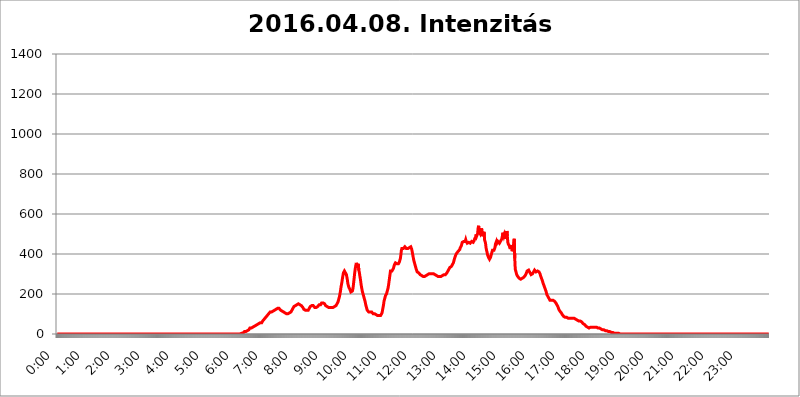
| Category | 2016.04.08. Intenzitás [W/m^2] |
|---|---|
| 0.0 | 0 |
| 0.0006944444444444445 | 0 |
| 0.001388888888888889 | 0 |
| 0.0020833333333333333 | 0 |
| 0.002777777777777778 | 0 |
| 0.003472222222222222 | 0 |
| 0.004166666666666667 | 0 |
| 0.004861111111111111 | 0 |
| 0.005555555555555556 | 0 |
| 0.0062499999999999995 | 0 |
| 0.006944444444444444 | 0 |
| 0.007638888888888889 | 0 |
| 0.008333333333333333 | 0 |
| 0.009027777777777779 | 0 |
| 0.009722222222222222 | 0 |
| 0.010416666666666666 | 0 |
| 0.011111111111111112 | 0 |
| 0.011805555555555555 | 0 |
| 0.012499999999999999 | 0 |
| 0.013194444444444444 | 0 |
| 0.013888888888888888 | 0 |
| 0.014583333333333332 | 0 |
| 0.015277777777777777 | 0 |
| 0.015972222222222224 | 0 |
| 0.016666666666666666 | 0 |
| 0.017361111111111112 | 0 |
| 0.018055555555555557 | 0 |
| 0.01875 | 0 |
| 0.019444444444444445 | 0 |
| 0.02013888888888889 | 0 |
| 0.020833333333333332 | 0 |
| 0.02152777777777778 | 0 |
| 0.022222222222222223 | 0 |
| 0.02291666666666667 | 0 |
| 0.02361111111111111 | 0 |
| 0.024305555555555556 | 0 |
| 0.024999999999999998 | 0 |
| 0.025694444444444447 | 0 |
| 0.02638888888888889 | 0 |
| 0.027083333333333334 | 0 |
| 0.027777777777777776 | 0 |
| 0.02847222222222222 | 0 |
| 0.029166666666666664 | 0 |
| 0.029861111111111113 | 0 |
| 0.030555555555555555 | 0 |
| 0.03125 | 0 |
| 0.03194444444444445 | 0 |
| 0.03263888888888889 | 0 |
| 0.03333333333333333 | 0 |
| 0.034027777777777775 | 0 |
| 0.034722222222222224 | 0 |
| 0.035416666666666666 | 0 |
| 0.036111111111111115 | 0 |
| 0.03680555555555556 | 0 |
| 0.0375 | 0 |
| 0.03819444444444444 | 0 |
| 0.03888888888888889 | 0 |
| 0.03958333333333333 | 0 |
| 0.04027777777777778 | 0 |
| 0.04097222222222222 | 0 |
| 0.041666666666666664 | 0 |
| 0.042361111111111106 | 0 |
| 0.04305555555555556 | 0 |
| 0.043750000000000004 | 0 |
| 0.044444444444444446 | 0 |
| 0.04513888888888889 | 0 |
| 0.04583333333333334 | 0 |
| 0.04652777777777778 | 0 |
| 0.04722222222222222 | 0 |
| 0.04791666666666666 | 0 |
| 0.04861111111111111 | 0 |
| 0.049305555555555554 | 0 |
| 0.049999999999999996 | 0 |
| 0.05069444444444445 | 0 |
| 0.051388888888888894 | 0 |
| 0.052083333333333336 | 0 |
| 0.05277777777777778 | 0 |
| 0.05347222222222222 | 0 |
| 0.05416666666666667 | 0 |
| 0.05486111111111111 | 0 |
| 0.05555555555555555 | 0 |
| 0.05625 | 0 |
| 0.05694444444444444 | 0 |
| 0.057638888888888885 | 0 |
| 0.05833333333333333 | 0 |
| 0.05902777777777778 | 0 |
| 0.059722222222222225 | 0 |
| 0.06041666666666667 | 0 |
| 0.061111111111111116 | 0 |
| 0.06180555555555556 | 0 |
| 0.0625 | 0 |
| 0.06319444444444444 | 0 |
| 0.06388888888888888 | 0 |
| 0.06458333333333334 | 0 |
| 0.06527777777777778 | 0 |
| 0.06597222222222222 | 0 |
| 0.06666666666666667 | 0 |
| 0.06736111111111111 | 0 |
| 0.06805555555555555 | 0 |
| 0.06874999999999999 | 0 |
| 0.06944444444444443 | 0 |
| 0.07013888888888889 | 0 |
| 0.07083333333333333 | 0 |
| 0.07152777777777779 | 0 |
| 0.07222222222222223 | 0 |
| 0.07291666666666667 | 0 |
| 0.07361111111111111 | 0 |
| 0.07430555555555556 | 0 |
| 0.075 | 0 |
| 0.07569444444444444 | 0 |
| 0.0763888888888889 | 0 |
| 0.07708333333333334 | 0 |
| 0.07777777777777778 | 0 |
| 0.07847222222222222 | 0 |
| 0.07916666666666666 | 0 |
| 0.0798611111111111 | 0 |
| 0.08055555555555556 | 0 |
| 0.08125 | 0 |
| 0.08194444444444444 | 0 |
| 0.08263888888888889 | 0 |
| 0.08333333333333333 | 0 |
| 0.08402777777777777 | 0 |
| 0.08472222222222221 | 0 |
| 0.08541666666666665 | 0 |
| 0.08611111111111112 | 0 |
| 0.08680555555555557 | 0 |
| 0.08750000000000001 | 0 |
| 0.08819444444444445 | 0 |
| 0.08888888888888889 | 0 |
| 0.08958333333333333 | 0 |
| 0.09027777777777778 | 0 |
| 0.09097222222222222 | 0 |
| 0.09166666666666667 | 0 |
| 0.09236111111111112 | 0 |
| 0.09305555555555556 | 0 |
| 0.09375 | 0 |
| 0.09444444444444444 | 0 |
| 0.09513888888888888 | 0 |
| 0.09583333333333333 | 0 |
| 0.09652777777777777 | 0 |
| 0.09722222222222222 | 0 |
| 0.09791666666666667 | 0 |
| 0.09861111111111111 | 0 |
| 0.09930555555555555 | 0 |
| 0.09999999999999999 | 0 |
| 0.10069444444444443 | 0 |
| 0.1013888888888889 | 0 |
| 0.10208333333333335 | 0 |
| 0.10277777777777779 | 0 |
| 0.10347222222222223 | 0 |
| 0.10416666666666667 | 0 |
| 0.10486111111111111 | 0 |
| 0.10555555555555556 | 0 |
| 0.10625 | 0 |
| 0.10694444444444444 | 0 |
| 0.1076388888888889 | 0 |
| 0.10833333333333334 | 0 |
| 0.10902777777777778 | 0 |
| 0.10972222222222222 | 0 |
| 0.1111111111111111 | 0 |
| 0.11180555555555556 | 0 |
| 0.11180555555555556 | 0 |
| 0.1125 | 0 |
| 0.11319444444444444 | 0 |
| 0.11388888888888889 | 0 |
| 0.11458333333333333 | 0 |
| 0.11527777777777777 | 0 |
| 0.11597222222222221 | 0 |
| 0.11666666666666665 | 0 |
| 0.1173611111111111 | 0 |
| 0.11805555555555557 | 0 |
| 0.11944444444444445 | 0 |
| 0.12013888888888889 | 0 |
| 0.12083333333333333 | 0 |
| 0.12152777777777778 | 0 |
| 0.12222222222222223 | 0 |
| 0.12291666666666667 | 0 |
| 0.12291666666666667 | 0 |
| 0.12361111111111112 | 0 |
| 0.12430555555555556 | 0 |
| 0.125 | 0 |
| 0.12569444444444444 | 0 |
| 0.12638888888888888 | 0 |
| 0.12708333333333333 | 0 |
| 0.16875 | 0 |
| 0.12847222222222224 | 0 |
| 0.12916666666666668 | 0 |
| 0.12986111111111112 | 0 |
| 0.13055555555555556 | 0 |
| 0.13125 | 0 |
| 0.13194444444444445 | 0 |
| 0.1326388888888889 | 0 |
| 0.13333333333333333 | 0 |
| 0.13402777777777777 | 0 |
| 0.13402777777777777 | 0 |
| 0.13472222222222222 | 0 |
| 0.13541666666666666 | 0 |
| 0.1361111111111111 | 0 |
| 0.13749999999999998 | 0 |
| 0.13819444444444443 | 0 |
| 0.1388888888888889 | 0 |
| 0.13958333333333334 | 0 |
| 0.14027777777777778 | 0 |
| 0.14097222222222222 | 0 |
| 0.14166666666666666 | 0 |
| 0.1423611111111111 | 0 |
| 0.14305555555555557 | 0 |
| 0.14375000000000002 | 0 |
| 0.14444444444444446 | 0 |
| 0.1451388888888889 | 0 |
| 0.1451388888888889 | 0 |
| 0.14652777777777778 | 0 |
| 0.14722222222222223 | 0 |
| 0.14791666666666667 | 0 |
| 0.1486111111111111 | 0 |
| 0.14930555555555555 | 0 |
| 0.15 | 0 |
| 0.15069444444444444 | 0 |
| 0.15138888888888888 | 0 |
| 0.15208333333333332 | 0 |
| 0.15277777777777776 | 0 |
| 0.15347222222222223 | 0 |
| 0.15416666666666667 | 0 |
| 0.15486111111111112 | 0 |
| 0.15555555555555556 | 0 |
| 0.15625 | 0 |
| 0.15694444444444444 | 0 |
| 0.15763888888888888 | 0 |
| 0.15833333333333333 | 0 |
| 0.15902777777777777 | 0 |
| 0.15972222222222224 | 0 |
| 0.16041666666666668 | 0 |
| 0.16111111111111112 | 0 |
| 0.16180555555555556 | 0 |
| 0.1625 | 0 |
| 0.16319444444444445 | 0 |
| 0.1638888888888889 | 0 |
| 0.16458333333333333 | 0 |
| 0.16527777777777777 | 0 |
| 0.16597222222222222 | 0 |
| 0.16666666666666666 | 0 |
| 0.1673611111111111 | 0 |
| 0.16805555555555554 | 0 |
| 0.16874999999999998 | 0 |
| 0.16944444444444443 | 0 |
| 0.17013888888888887 | 0 |
| 0.1708333333333333 | 0 |
| 0.17152777777777775 | 0 |
| 0.17222222222222225 | 0 |
| 0.1729166666666667 | 0 |
| 0.17361111111111113 | 0 |
| 0.17430555555555557 | 0 |
| 0.17500000000000002 | 0 |
| 0.17569444444444446 | 0 |
| 0.1763888888888889 | 0 |
| 0.17708333333333334 | 0 |
| 0.17777777777777778 | 0 |
| 0.17847222222222223 | 0 |
| 0.17916666666666667 | 0 |
| 0.1798611111111111 | 0 |
| 0.18055555555555555 | 0 |
| 0.18125 | 0 |
| 0.18194444444444444 | 0 |
| 0.1826388888888889 | 0 |
| 0.18333333333333335 | 0 |
| 0.1840277777777778 | 0 |
| 0.18472222222222223 | 0 |
| 0.18541666666666667 | 0 |
| 0.18611111111111112 | 0 |
| 0.18680555555555556 | 0 |
| 0.1875 | 0 |
| 0.18819444444444444 | 0 |
| 0.18888888888888888 | 0 |
| 0.18958333333333333 | 0 |
| 0.19027777777777777 | 0 |
| 0.1909722222222222 | 0 |
| 0.19166666666666665 | 0 |
| 0.19236111111111112 | 0 |
| 0.19305555555555554 | 0 |
| 0.19375 | 0 |
| 0.19444444444444445 | 0 |
| 0.1951388888888889 | 0 |
| 0.19583333333333333 | 0 |
| 0.19652777777777777 | 0 |
| 0.19722222222222222 | 0 |
| 0.19791666666666666 | 0 |
| 0.1986111111111111 | 0 |
| 0.19930555555555554 | 0 |
| 0.19999999999999998 | 0 |
| 0.20069444444444443 | 0 |
| 0.20138888888888887 | 0 |
| 0.2020833333333333 | 0 |
| 0.2027777777777778 | 0 |
| 0.2034722222222222 | 0 |
| 0.2041666666666667 | 0 |
| 0.20486111111111113 | 0 |
| 0.20555555555555557 | 0 |
| 0.20625000000000002 | 0 |
| 0.20694444444444446 | 0 |
| 0.2076388888888889 | 0 |
| 0.20833333333333334 | 0 |
| 0.20902777777777778 | 0 |
| 0.20972222222222223 | 0 |
| 0.21041666666666667 | 0 |
| 0.2111111111111111 | 0 |
| 0.21180555555555555 | 0 |
| 0.2125 | 0 |
| 0.21319444444444444 | 0 |
| 0.2138888888888889 | 0 |
| 0.21458333333333335 | 0 |
| 0.2152777777777778 | 0 |
| 0.21597222222222223 | 0 |
| 0.21666666666666667 | 0 |
| 0.21736111111111112 | 0 |
| 0.21805555555555556 | 0 |
| 0.21875 | 0 |
| 0.21944444444444444 | 0 |
| 0.22013888888888888 | 0 |
| 0.22083333333333333 | 0 |
| 0.22152777777777777 | 0 |
| 0.2222222222222222 | 0 |
| 0.22291666666666665 | 0 |
| 0.2236111111111111 | 0 |
| 0.22430555555555556 | 0 |
| 0.225 | 0 |
| 0.22569444444444445 | 0 |
| 0.2263888888888889 | 0 |
| 0.22708333333333333 | 0 |
| 0.22777777777777777 | 0 |
| 0.22847222222222222 | 0 |
| 0.22916666666666666 | 0 |
| 0.2298611111111111 | 0 |
| 0.23055555555555554 | 0 |
| 0.23124999999999998 | 0 |
| 0.23194444444444443 | 0 |
| 0.23263888888888887 | 0 |
| 0.2333333333333333 | 0 |
| 0.2340277777777778 | 0 |
| 0.2347222222222222 | 0 |
| 0.2354166666666667 | 0 |
| 0.23611111111111113 | 0 |
| 0.23680555555555557 | 0 |
| 0.23750000000000002 | 0 |
| 0.23819444444444446 | 0 |
| 0.2388888888888889 | 0 |
| 0.23958333333333334 | 0 |
| 0.24027777777777778 | 0 |
| 0.24097222222222223 | 0 |
| 0.24166666666666667 | 0 |
| 0.2423611111111111 | 0 |
| 0.24305555555555555 | 0 |
| 0.24375 | 0 |
| 0.24444444444444446 | 0 |
| 0.24513888888888888 | 0 |
| 0.24583333333333335 | 0 |
| 0.2465277777777778 | 0 |
| 0.24722222222222223 | 0 |
| 0.24791666666666667 | 0 |
| 0.24861111111111112 | 0 |
| 0.24930555555555556 | 0 |
| 0.25 | 0 |
| 0.25069444444444444 | 0 |
| 0.2513888888888889 | 0 |
| 0.2520833333333333 | 0 |
| 0.25277777777777777 | 0 |
| 0.2534722222222222 | 0 |
| 0.25416666666666665 | 0 |
| 0.2548611111111111 | 0 |
| 0.2555555555555556 | 0 |
| 0.25625000000000003 | 0 |
| 0.2569444444444445 | 3.525 |
| 0.2576388888888889 | 3.525 |
| 0.25833333333333336 | 3.525 |
| 0.2590277777777778 | 3.525 |
| 0.25972222222222224 | 3.525 |
| 0.2604166666666667 | 3.525 |
| 0.2611111111111111 | 7.887 |
| 0.26180555555555557 | 7.887 |
| 0.2625 | 12.257 |
| 0.26319444444444445 | 12.257 |
| 0.2638888888888889 | 12.257 |
| 0.26458333333333334 | 12.257 |
| 0.2652777777777778 | 16.636 |
| 0.2659722222222222 | 16.636 |
| 0.26666666666666666 | 16.636 |
| 0.2673611111111111 | 21.024 |
| 0.26805555555555555 | 21.024 |
| 0.26875 | 21.024 |
| 0.26944444444444443 | 25.419 |
| 0.2701388888888889 | 29.823 |
| 0.2708333333333333 | 29.823 |
| 0.27152777777777776 | 29.823 |
| 0.2722222222222222 | 29.823 |
| 0.27291666666666664 | 34.234 |
| 0.2736111111111111 | 34.234 |
| 0.2743055555555555 | 34.234 |
| 0.27499999999999997 | 38.653 |
| 0.27569444444444446 | 38.653 |
| 0.27638888888888885 | 38.653 |
| 0.27708333333333335 | 43.079 |
| 0.2777777777777778 | 43.079 |
| 0.27847222222222223 | 43.079 |
| 0.2791666666666667 | 43.079 |
| 0.2798611111111111 | 47.511 |
| 0.28055555555555556 | 47.511 |
| 0.28125 | 47.511 |
| 0.28194444444444444 | 47.511 |
| 0.2826388888888889 | 51.951 |
| 0.2833333333333333 | 51.951 |
| 0.28402777777777777 | 51.951 |
| 0.2847222222222222 | 56.398 |
| 0.28541666666666665 | 56.398 |
| 0.28611111111111115 | 56.398 |
| 0.28680555555555554 | 56.398 |
| 0.28750000000000003 | 60.85 |
| 0.2881944444444445 | 65.31 |
| 0.2888888888888889 | 65.31 |
| 0.28958333333333336 | 69.775 |
| 0.2902777777777778 | 74.246 |
| 0.29097222222222224 | 74.246 |
| 0.2916666666666667 | 78.722 |
| 0.2923611111111111 | 83.205 |
| 0.29305555555555557 | 83.205 |
| 0.29375 | 87.692 |
| 0.29444444444444445 | 92.184 |
| 0.2951388888888889 | 96.682 |
| 0.29583333333333334 | 96.682 |
| 0.2965277777777778 | 101.184 |
| 0.2972222222222222 | 105.69 |
| 0.29791666666666666 | 105.69 |
| 0.2986111111111111 | 110.201 |
| 0.29930555555555555 | 110.201 |
| 0.3 | 110.201 |
| 0.30069444444444443 | 110.201 |
| 0.3013888888888889 | 110.201 |
| 0.3020833333333333 | 110.201 |
| 0.30277777777777776 | 114.716 |
| 0.3034722222222222 | 114.716 |
| 0.30416666666666664 | 119.235 |
| 0.3048611111111111 | 119.235 |
| 0.3055555555555555 | 119.235 |
| 0.30624999999999997 | 123.758 |
| 0.3069444444444444 | 123.758 |
| 0.3076388888888889 | 128.284 |
| 0.30833333333333335 | 128.284 |
| 0.3090277777777778 | 128.284 |
| 0.30972222222222223 | 128.284 |
| 0.3104166666666667 | 128.284 |
| 0.3111111111111111 | 128.284 |
| 0.31180555555555556 | 123.758 |
| 0.3125 | 123.758 |
| 0.31319444444444444 | 119.235 |
| 0.3138888888888889 | 119.235 |
| 0.3145833333333333 | 119.235 |
| 0.31527777777777777 | 114.716 |
| 0.3159722222222222 | 110.201 |
| 0.31666666666666665 | 110.201 |
| 0.31736111111111115 | 110.201 |
| 0.31805555555555554 | 105.69 |
| 0.31875000000000003 | 105.69 |
| 0.3194444444444445 | 105.69 |
| 0.3201388888888889 | 101.184 |
| 0.32083333333333336 | 101.184 |
| 0.3215277777777778 | 101.184 |
| 0.32222222222222224 | 101.184 |
| 0.3229166666666667 | 101.184 |
| 0.3236111111111111 | 101.184 |
| 0.32430555555555557 | 101.184 |
| 0.325 | 105.69 |
| 0.32569444444444445 | 105.69 |
| 0.3263888888888889 | 105.69 |
| 0.32708333333333334 | 105.69 |
| 0.3277777777777778 | 110.201 |
| 0.3284722222222222 | 114.716 |
| 0.32916666666666666 | 119.235 |
| 0.3298611111111111 | 123.758 |
| 0.33055555555555555 | 128.284 |
| 0.33125 | 132.814 |
| 0.33194444444444443 | 137.347 |
| 0.3326388888888889 | 137.347 |
| 0.3333333333333333 | 141.884 |
| 0.3340277777777778 | 141.884 |
| 0.3347222222222222 | 146.423 |
| 0.3354166666666667 | 146.423 |
| 0.3361111111111111 | 146.423 |
| 0.3368055555555556 | 146.423 |
| 0.33749999999999997 | 150.964 |
| 0.33819444444444446 | 150.964 |
| 0.33888888888888885 | 150.964 |
| 0.33958333333333335 | 146.423 |
| 0.34027777777777773 | 146.423 |
| 0.34097222222222223 | 146.423 |
| 0.3416666666666666 | 146.423 |
| 0.3423611111111111 | 141.884 |
| 0.3430555555555555 | 141.884 |
| 0.34375 | 137.347 |
| 0.3444444444444445 | 132.814 |
| 0.3451388888888889 | 128.284 |
| 0.3458333333333334 | 123.758 |
| 0.34652777777777777 | 119.235 |
| 0.34722222222222227 | 119.235 |
| 0.34791666666666665 | 119.235 |
| 0.34861111111111115 | 114.716 |
| 0.34930555555555554 | 114.716 |
| 0.35000000000000003 | 119.235 |
| 0.3506944444444444 | 119.235 |
| 0.3513888888888889 | 119.235 |
| 0.3520833333333333 | 119.235 |
| 0.3527777777777778 | 123.758 |
| 0.3534722222222222 | 128.284 |
| 0.3541666666666667 | 132.814 |
| 0.3548611111111111 | 137.347 |
| 0.35555555555555557 | 137.347 |
| 0.35625 | 141.884 |
| 0.35694444444444445 | 141.884 |
| 0.3576388888888889 | 141.884 |
| 0.35833333333333334 | 141.884 |
| 0.3590277777777778 | 141.884 |
| 0.3597222222222222 | 137.347 |
| 0.36041666666666666 | 137.347 |
| 0.3611111111111111 | 132.814 |
| 0.36180555555555555 | 132.814 |
| 0.3625 | 132.814 |
| 0.36319444444444443 | 132.814 |
| 0.3638888888888889 | 137.347 |
| 0.3645833333333333 | 137.347 |
| 0.3652777777777778 | 137.347 |
| 0.3659722222222222 | 137.347 |
| 0.3666666666666667 | 141.884 |
| 0.3673611111111111 | 146.423 |
| 0.3680555555555556 | 146.423 |
| 0.36874999999999997 | 146.423 |
| 0.36944444444444446 | 146.423 |
| 0.37013888888888885 | 150.964 |
| 0.37083333333333335 | 155.509 |
| 0.37152777777777773 | 155.509 |
| 0.37222222222222223 | 155.509 |
| 0.3729166666666666 | 155.509 |
| 0.3736111111111111 | 155.509 |
| 0.3743055555555555 | 155.509 |
| 0.375 | 150.964 |
| 0.3756944444444445 | 146.423 |
| 0.3763888888888889 | 141.884 |
| 0.3770833333333334 | 141.884 |
| 0.37777777777777777 | 137.347 |
| 0.37847222222222227 | 137.347 |
| 0.37916666666666665 | 132.814 |
| 0.37986111111111115 | 132.814 |
| 0.38055555555555554 | 132.814 |
| 0.38125000000000003 | 132.814 |
| 0.3819444444444444 | 132.814 |
| 0.3826388888888889 | 132.814 |
| 0.3833333333333333 | 132.814 |
| 0.3840277777777778 | 132.814 |
| 0.3847222222222222 | 132.814 |
| 0.3854166666666667 | 132.814 |
| 0.3861111111111111 | 132.814 |
| 0.38680555555555557 | 132.814 |
| 0.3875 | 137.347 |
| 0.38819444444444445 | 137.347 |
| 0.3888888888888889 | 137.347 |
| 0.38958333333333334 | 141.884 |
| 0.3902777777777778 | 141.884 |
| 0.3909722222222222 | 141.884 |
| 0.39166666666666666 | 146.423 |
| 0.3923611111111111 | 150.964 |
| 0.39305555555555555 | 155.509 |
| 0.39375 | 160.056 |
| 0.39444444444444443 | 169.156 |
| 0.3951388888888889 | 178.264 |
| 0.3958333333333333 | 187.378 |
| 0.3965277777777778 | 201.058 |
| 0.3972222222222222 | 214.746 |
| 0.3979166666666667 | 233 |
| 0.3986111111111111 | 246.689 |
| 0.3993055555555556 | 260.373 |
| 0.39999999999999997 | 278.603 |
| 0.40069444444444446 | 292.259 |
| 0.40138888888888885 | 305.898 |
| 0.40208333333333335 | 310.44 |
| 0.40277777777777773 | 314.98 |
| 0.40347222222222223 | 310.44 |
| 0.4041666666666666 | 305.898 |
| 0.4048611111111111 | 301.354 |
| 0.4055555555555555 | 296.808 |
| 0.40625 | 283.156 |
| 0.4069444444444445 | 269.49 |
| 0.4076388888888889 | 251.251 |
| 0.4083333333333334 | 246.689 |
| 0.40902777777777777 | 233 |
| 0.40972222222222227 | 228.436 |
| 0.41041666666666665 | 223.873 |
| 0.41111111111111115 | 219.309 |
| 0.41180555555555554 | 210.182 |
| 0.41250000000000003 | 210.182 |
| 0.4131944444444444 | 210.182 |
| 0.4138888888888889 | 214.746 |
| 0.4145833333333333 | 223.873 |
| 0.4152777777777778 | 242.127 |
| 0.4159722222222222 | 264.932 |
| 0.4166666666666667 | 287.709 |
| 0.4173611111111111 | 310.44 |
| 0.41805555555555557 | 328.584 |
| 0.41875 | 333.113 |
| 0.41944444444444445 | 355.712 |
| 0.4201388888888889 | 351.198 |
| 0.42083333333333334 | 333.113 |
| 0.4215277777777778 | 333.113 |
| 0.4222222222222222 | 351.198 |
| 0.42291666666666666 | 319.517 |
| 0.4236111111111111 | 310.44 |
| 0.42430555555555555 | 292.259 |
| 0.425 | 278.603 |
| 0.42569444444444443 | 260.373 |
| 0.4263888888888889 | 242.127 |
| 0.4270833333333333 | 228.436 |
| 0.4277777777777778 | 214.746 |
| 0.4284722222222222 | 205.62 |
| 0.4291666666666667 | 196.497 |
| 0.4298611111111111 | 187.378 |
| 0.4305555555555556 | 178.264 |
| 0.43124999999999997 | 169.156 |
| 0.43194444444444446 | 160.056 |
| 0.43263888888888885 | 146.423 |
| 0.43333333333333335 | 137.347 |
| 0.43402777777777773 | 128.284 |
| 0.43472222222222223 | 119.235 |
| 0.4354166666666666 | 114.716 |
| 0.4361111111111111 | 114.716 |
| 0.4368055555555555 | 110.201 |
| 0.4375 | 110.201 |
| 0.4381944444444445 | 110.201 |
| 0.4388888888888889 | 110.201 |
| 0.4395833333333334 | 110.201 |
| 0.44027777777777777 | 110.201 |
| 0.44097222222222227 | 110.201 |
| 0.44166666666666665 | 105.69 |
| 0.44236111111111115 | 105.69 |
| 0.44305555555555554 | 101.184 |
| 0.44375000000000003 | 101.184 |
| 0.4444444444444444 | 101.184 |
| 0.4451388888888889 | 101.184 |
| 0.4458333333333333 | 101.184 |
| 0.4465277777777778 | 101.184 |
| 0.4472222222222222 | 96.682 |
| 0.4479166666666667 | 96.682 |
| 0.4486111111111111 | 96.682 |
| 0.44930555555555557 | 92.184 |
| 0.45 | 92.184 |
| 0.45069444444444445 | 92.184 |
| 0.4513888888888889 | 92.184 |
| 0.45208333333333334 | 87.692 |
| 0.4527777777777778 | 87.692 |
| 0.4534722222222222 | 92.184 |
| 0.45416666666666666 | 92.184 |
| 0.4548611111111111 | 96.682 |
| 0.45555555555555555 | 105.69 |
| 0.45625 | 119.235 |
| 0.45694444444444443 | 132.814 |
| 0.4576388888888889 | 146.423 |
| 0.4583333333333333 | 164.605 |
| 0.4590277777777778 | 173.709 |
| 0.4597222222222222 | 182.82 |
| 0.4604166666666667 | 191.937 |
| 0.4611111111111111 | 196.497 |
| 0.4618055555555556 | 201.058 |
| 0.46249999999999997 | 210.182 |
| 0.46319444444444446 | 219.309 |
| 0.46388888888888885 | 228.436 |
| 0.46458333333333335 | 242.127 |
| 0.46527777777777773 | 260.373 |
| 0.46597222222222223 | 278.603 |
| 0.4666666666666666 | 296.808 |
| 0.4673611111111111 | 314.98 |
| 0.4680555555555555 | 319.517 |
| 0.46875 | 319.517 |
| 0.4694444444444445 | 314.98 |
| 0.4701388888888889 | 314.98 |
| 0.4708333333333334 | 319.517 |
| 0.47152777777777777 | 328.584 |
| 0.47222222222222227 | 337.639 |
| 0.47291666666666665 | 346.682 |
| 0.47361111111111115 | 351.198 |
| 0.47430555555555554 | 355.712 |
| 0.47500000000000003 | 351.198 |
| 0.4756944444444444 | 351.198 |
| 0.4763888888888889 | 351.198 |
| 0.4770833333333333 | 351.198 |
| 0.4777777777777778 | 351.198 |
| 0.4784722222222222 | 351.198 |
| 0.4791666666666667 | 355.712 |
| 0.4798611111111111 | 360.221 |
| 0.48055555555555557 | 369.23 |
| 0.48125 | 378.224 |
| 0.48194444444444445 | 396.164 |
| 0.4826388888888889 | 418.492 |
| 0.48333333333333334 | 427.39 |
| 0.4840277777777778 | 422.943 |
| 0.4847222222222222 | 427.39 |
| 0.48541666666666666 | 427.39 |
| 0.4861111111111111 | 431.833 |
| 0.48680555555555555 | 431.833 |
| 0.4875 | 436.27 |
| 0.48819444444444443 | 440.702 |
| 0.4888888888888889 | 431.833 |
| 0.4895833333333333 | 427.39 |
| 0.4902777777777778 | 427.39 |
| 0.4909722222222222 | 431.833 |
| 0.4916666666666667 | 427.39 |
| 0.4923611111111111 | 427.39 |
| 0.4930555555555556 | 431.833 |
| 0.49374999999999997 | 431.833 |
| 0.49444444444444446 | 431.833 |
| 0.49513888888888885 | 436.27 |
| 0.49583333333333335 | 436.27 |
| 0.49652777777777773 | 436.27 |
| 0.49722222222222223 | 422.943 |
| 0.4979166666666666 | 409.574 |
| 0.4986111111111111 | 396.164 |
| 0.4993055555555555 | 382.715 |
| 0.5 | 369.23 |
| 0.5006944444444444 | 360.221 |
| 0.5013888888888889 | 351.198 |
| 0.5020833333333333 | 342.162 |
| 0.5027777777777778 | 333.113 |
| 0.5034722222222222 | 324.052 |
| 0.5041666666666667 | 319.517 |
| 0.5048611111111111 | 310.44 |
| 0.5055555555555555 | 305.898 |
| 0.50625 | 305.898 |
| 0.5069444444444444 | 305.898 |
| 0.5076388888888889 | 301.354 |
| 0.5083333333333333 | 301.354 |
| 0.5090277777777777 | 296.808 |
| 0.5097222222222222 | 296.808 |
| 0.5104166666666666 | 296.808 |
| 0.5111111111111112 | 292.259 |
| 0.5118055555555555 | 292.259 |
| 0.5125000000000001 | 292.259 |
| 0.5131944444444444 | 287.709 |
| 0.513888888888889 | 287.709 |
| 0.5145833333333333 | 287.709 |
| 0.5152777777777778 | 287.709 |
| 0.5159722222222222 | 287.709 |
| 0.5166666666666667 | 287.709 |
| 0.517361111111111 | 292.259 |
| 0.5180555555555556 | 292.259 |
| 0.5187499999999999 | 296.808 |
| 0.5194444444444445 | 296.808 |
| 0.5201388888888888 | 296.808 |
| 0.5208333333333334 | 301.354 |
| 0.5215277777777778 | 301.354 |
| 0.5222222222222223 | 301.354 |
| 0.5229166666666667 | 301.354 |
| 0.5236111111111111 | 301.354 |
| 0.5243055555555556 | 301.354 |
| 0.525 | 301.354 |
| 0.5256944444444445 | 301.354 |
| 0.5263888888888889 | 305.898 |
| 0.5270833333333333 | 305.898 |
| 0.5277777777777778 | 301.354 |
| 0.5284722222222222 | 301.354 |
| 0.5291666666666667 | 301.354 |
| 0.5298611111111111 | 296.808 |
| 0.5305555555555556 | 296.808 |
| 0.53125 | 292.259 |
| 0.5319444444444444 | 292.259 |
| 0.5326388888888889 | 287.709 |
| 0.5333333333333333 | 287.709 |
| 0.5340277777777778 | 287.709 |
| 0.5347222222222222 | 283.156 |
| 0.5354166666666667 | 283.156 |
| 0.5361111111111111 | 287.709 |
| 0.5368055555555555 | 287.709 |
| 0.5375 | 287.709 |
| 0.5381944444444444 | 287.709 |
| 0.5388888888888889 | 292.259 |
| 0.5395833333333333 | 292.259 |
| 0.5402777777777777 | 292.259 |
| 0.5409722222222222 | 296.808 |
| 0.5416666666666666 | 296.808 |
| 0.5423611111111112 | 296.808 |
| 0.5430555555555555 | 296.808 |
| 0.5437500000000001 | 296.808 |
| 0.5444444444444444 | 296.808 |
| 0.545138888888889 | 296.808 |
| 0.5458333333333333 | 301.354 |
| 0.5465277777777778 | 305.898 |
| 0.5472222222222222 | 310.44 |
| 0.5479166666666667 | 314.98 |
| 0.548611111111111 | 319.517 |
| 0.5493055555555556 | 324.052 |
| 0.5499999999999999 | 328.584 |
| 0.5506944444444445 | 333.113 |
| 0.5513888888888888 | 333.113 |
| 0.5520833333333334 | 337.639 |
| 0.5527777777777778 | 337.639 |
| 0.5534722222222223 | 342.162 |
| 0.5541666666666667 | 346.682 |
| 0.5548611111111111 | 351.198 |
| 0.5555555555555556 | 355.712 |
| 0.55625 | 364.728 |
| 0.5569444444444445 | 373.729 |
| 0.5576388888888889 | 382.715 |
| 0.5583333333333333 | 387.202 |
| 0.5590277777777778 | 396.164 |
| 0.5597222222222222 | 400.638 |
| 0.5604166666666667 | 405.108 |
| 0.5611111111111111 | 405.108 |
| 0.5618055555555556 | 409.574 |
| 0.5625 | 414.035 |
| 0.5631944444444444 | 418.492 |
| 0.5638888888888889 | 418.492 |
| 0.5645833333333333 | 422.943 |
| 0.5652777777777778 | 431.833 |
| 0.5659722222222222 | 436.27 |
| 0.5666666666666667 | 440.702 |
| 0.5673611111111111 | 449.551 |
| 0.5680555555555555 | 458.38 |
| 0.56875 | 458.38 |
| 0.5694444444444444 | 458.38 |
| 0.5701388888888889 | 462.786 |
| 0.5708333333333333 | 467.187 |
| 0.5715277777777777 | 467.187 |
| 0.5722222222222222 | 462.786 |
| 0.5729166666666666 | 471.582 |
| 0.5736111111111112 | 462.786 |
| 0.5743055555555555 | 458.38 |
| 0.5750000000000001 | 453.968 |
| 0.5756944444444444 | 453.968 |
| 0.576388888888889 | 458.38 |
| 0.5770833333333333 | 458.38 |
| 0.5777777777777778 | 458.38 |
| 0.5784722222222222 | 453.968 |
| 0.5791666666666667 | 453.968 |
| 0.579861111111111 | 453.968 |
| 0.5805555555555556 | 458.38 |
| 0.5812499999999999 | 462.786 |
| 0.5819444444444445 | 462.786 |
| 0.5826388888888888 | 458.38 |
| 0.5833333333333334 | 458.38 |
| 0.5840277777777778 | 462.786 |
| 0.5847222222222223 | 467.187 |
| 0.5854166666666667 | 475.972 |
| 0.5861111111111111 | 480.356 |
| 0.5868055555555556 | 484.735 |
| 0.5875 | 497.836 |
| 0.5881944444444445 | 489.108 |
| 0.5888888888888889 | 489.108 |
| 0.5895833333333333 | 502.192 |
| 0.5902777777777778 | 528.2 |
| 0.5909722222222222 | 541.121 |
| 0.5916666666666667 | 510.885 |
| 0.5923611111111111 | 506.542 |
| 0.5930555555555556 | 502.192 |
| 0.59375 | 515.223 |
| 0.5944444444444444 | 515.223 |
| 0.5951388888888889 | 528.2 |
| 0.5958333333333333 | 502.192 |
| 0.5965277777777778 | 489.108 |
| 0.5972222222222222 | 489.108 |
| 0.5979166666666667 | 493.475 |
| 0.5986111111111111 | 510.885 |
| 0.5993055555555555 | 471.582 |
| 0.6 | 462.786 |
| 0.6006944444444444 | 453.968 |
| 0.6013888888888889 | 431.833 |
| 0.6020833333333333 | 418.492 |
| 0.6027777777777777 | 409.574 |
| 0.6034722222222222 | 396.164 |
| 0.6041666666666666 | 391.685 |
| 0.6048611111111112 | 382.715 |
| 0.6055555555555555 | 378.224 |
| 0.6062500000000001 | 373.729 |
| 0.6069444444444444 | 378.224 |
| 0.607638888888889 | 382.715 |
| 0.6083333333333333 | 391.685 |
| 0.6090277777777778 | 400.638 |
| 0.6097222222222222 | 409.574 |
| 0.6104166666666667 | 418.492 |
| 0.611111111111111 | 422.943 |
| 0.6118055555555556 | 422.943 |
| 0.6124999999999999 | 418.492 |
| 0.6131944444444445 | 418.492 |
| 0.6138888888888888 | 431.833 |
| 0.6145833333333334 | 449.551 |
| 0.6152777777777778 | 453.968 |
| 0.6159722222222223 | 462.786 |
| 0.6166666666666667 | 453.968 |
| 0.6173611111111111 | 453.968 |
| 0.6180555555555556 | 462.786 |
| 0.61875 | 462.786 |
| 0.6194444444444445 | 462.786 |
| 0.6201388888888889 | 453.968 |
| 0.6208333333333333 | 458.38 |
| 0.6215277777777778 | 462.786 |
| 0.6222222222222222 | 467.187 |
| 0.6229166666666667 | 467.187 |
| 0.6236111111111111 | 475.972 |
| 0.6243055555555556 | 489.108 |
| 0.625 | 506.542 |
| 0.6256944444444444 | 497.836 |
| 0.6263888888888889 | 489.108 |
| 0.6270833333333333 | 497.836 |
| 0.6277777777777778 | 489.108 |
| 0.6284722222222222 | 475.972 |
| 0.6291666666666667 | 497.836 |
| 0.6298611111111111 | 484.735 |
| 0.6305555555555555 | 515.223 |
| 0.63125 | 489.108 |
| 0.6319444444444444 | 458.38 |
| 0.6326388888888889 | 449.551 |
| 0.6333333333333333 | 445.129 |
| 0.6340277777777777 | 440.702 |
| 0.6347222222222222 | 431.833 |
| 0.6354166666666666 | 427.39 |
| 0.6361111111111112 | 427.39 |
| 0.6368055555555555 | 431.833 |
| 0.6375000000000001 | 445.129 |
| 0.6381944444444444 | 414.035 |
| 0.638888888888889 | 418.492 |
| 0.6395833333333333 | 436.27 |
| 0.6402777777777778 | 440.702 |
| 0.6409722222222222 | 475.972 |
| 0.6416666666666667 | 378.224 |
| 0.642361111111111 | 324.052 |
| 0.6430555555555556 | 314.98 |
| 0.6437499999999999 | 305.898 |
| 0.6444444444444445 | 296.808 |
| 0.6451388888888888 | 296.808 |
| 0.6458333333333334 | 287.709 |
| 0.6465277777777778 | 287.709 |
| 0.6472222222222223 | 283.156 |
| 0.6479166666666667 | 278.603 |
| 0.6486111111111111 | 278.603 |
| 0.6493055555555556 | 274.047 |
| 0.65 | 274.047 |
| 0.6506944444444445 | 274.047 |
| 0.6513888888888889 | 274.047 |
| 0.6520833333333333 | 278.603 |
| 0.6527777777777778 | 278.603 |
| 0.6534722222222222 | 283.156 |
| 0.6541666666666667 | 283.156 |
| 0.6548611111111111 | 287.709 |
| 0.6555555555555556 | 287.709 |
| 0.65625 | 292.259 |
| 0.6569444444444444 | 296.808 |
| 0.6576388888888889 | 301.354 |
| 0.6583333333333333 | 305.898 |
| 0.6590277777777778 | 314.98 |
| 0.6597222222222222 | 319.517 |
| 0.6604166666666667 | 319.517 |
| 0.6611111111111111 | 319.517 |
| 0.6618055555555555 | 319.517 |
| 0.6625 | 314.98 |
| 0.6631944444444444 | 305.898 |
| 0.6638888888888889 | 305.898 |
| 0.6645833333333333 | 296.808 |
| 0.6652777777777777 | 296.808 |
| 0.6659722222222222 | 296.808 |
| 0.6666666666666666 | 301.354 |
| 0.6673611111111111 | 305.898 |
| 0.6680555555555556 | 310.44 |
| 0.6687500000000001 | 314.98 |
| 0.6694444444444444 | 319.517 |
| 0.6701388888888888 | 314.98 |
| 0.6708333333333334 | 314.98 |
| 0.6715277777777778 | 310.44 |
| 0.6722222222222222 | 310.44 |
| 0.6729166666666666 | 314.98 |
| 0.6736111111111112 | 314.98 |
| 0.6743055555555556 | 314.98 |
| 0.6749999999999999 | 314.98 |
| 0.6756944444444444 | 310.44 |
| 0.6763888888888889 | 305.898 |
| 0.6770833333333334 | 301.354 |
| 0.6777777777777777 | 292.259 |
| 0.6784722222222223 | 287.709 |
| 0.6791666666666667 | 278.603 |
| 0.6798611111111111 | 274.047 |
| 0.6805555555555555 | 264.932 |
| 0.68125 | 255.813 |
| 0.6819444444444445 | 251.251 |
| 0.6826388888888889 | 242.127 |
| 0.6833333333333332 | 237.564 |
| 0.6840277777777778 | 228.436 |
| 0.6847222222222222 | 223.873 |
| 0.6854166666666667 | 214.746 |
| 0.686111111111111 | 205.62 |
| 0.6868055555555556 | 196.497 |
| 0.6875 | 191.937 |
| 0.6881944444444444 | 187.378 |
| 0.688888888888889 | 182.82 |
| 0.6895833333333333 | 178.264 |
| 0.6902777777777778 | 173.709 |
| 0.6909722222222222 | 169.156 |
| 0.6916666666666668 | 169.156 |
| 0.6923611111111111 | 169.156 |
| 0.6930555555555555 | 169.156 |
| 0.69375 | 169.156 |
| 0.6944444444444445 | 169.156 |
| 0.6951388888888889 | 169.156 |
| 0.6958333333333333 | 169.156 |
| 0.6965277777777777 | 164.605 |
| 0.6972222222222223 | 164.605 |
| 0.6979166666666666 | 164.605 |
| 0.6986111111111111 | 160.056 |
| 0.6993055555555556 | 155.509 |
| 0.7000000000000001 | 150.964 |
| 0.7006944444444444 | 146.423 |
| 0.7013888888888888 | 141.884 |
| 0.7020833333333334 | 137.347 |
| 0.7027777777777778 | 132.814 |
| 0.7034722222222222 | 123.758 |
| 0.7041666666666666 | 119.235 |
| 0.7048611111111112 | 114.716 |
| 0.7055555555555556 | 110.201 |
| 0.7062499999999999 | 110.201 |
| 0.7069444444444444 | 105.69 |
| 0.7076388888888889 | 101.184 |
| 0.7083333333333334 | 96.682 |
| 0.7090277777777777 | 92.184 |
| 0.7097222222222223 | 92.184 |
| 0.7104166666666667 | 87.692 |
| 0.7111111111111111 | 83.205 |
| 0.7118055555555555 | 83.205 |
| 0.7125 | 83.205 |
| 0.7131944444444445 | 83.205 |
| 0.7138888888888889 | 83.205 |
| 0.7145833333333332 | 83.205 |
| 0.7152777777777778 | 78.722 |
| 0.7159722222222222 | 78.722 |
| 0.7166666666666667 | 78.722 |
| 0.717361111111111 | 78.722 |
| 0.7180555555555556 | 78.722 |
| 0.71875 | 78.722 |
| 0.7194444444444444 | 78.722 |
| 0.720138888888889 | 78.722 |
| 0.7208333333333333 | 78.722 |
| 0.7215277777777778 | 78.722 |
| 0.7222222222222222 | 78.722 |
| 0.7229166666666668 | 78.722 |
| 0.7236111111111111 | 78.722 |
| 0.7243055555555555 | 78.722 |
| 0.725 | 78.722 |
| 0.7256944444444445 | 74.246 |
| 0.7263888888888889 | 74.246 |
| 0.7270833333333333 | 74.246 |
| 0.7277777777777777 | 69.775 |
| 0.7284722222222223 | 69.775 |
| 0.7291666666666666 | 69.775 |
| 0.7298611111111111 | 69.775 |
| 0.7305555555555556 | 65.31 |
| 0.7312500000000001 | 65.31 |
| 0.7319444444444444 | 65.31 |
| 0.7326388888888888 | 65.31 |
| 0.7333333333333334 | 65.31 |
| 0.7340277777777778 | 65.31 |
| 0.7347222222222222 | 60.85 |
| 0.7354166666666666 | 60.85 |
| 0.7361111111111112 | 56.398 |
| 0.7368055555555556 | 56.398 |
| 0.7374999999999999 | 51.951 |
| 0.7381944444444444 | 51.951 |
| 0.7388888888888889 | 47.511 |
| 0.7395833333333334 | 47.511 |
| 0.7402777777777777 | 43.079 |
| 0.7409722222222223 | 43.079 |
| 0.7416666666666667 | 38.653 |
| 0.7423611111111111 | 38.653 |
| 0.7430555555555555 | 38.653 |
| 0.74375 | 34.234 |
| 0.7444444444444445 | 34.234 |
| 0.7451388888888889 | 34.234 |
| 0.7458333333333332 | 29.823 |
| 0.7465277777777778 | 29.823 |
| 0.7472222222222222 | 29.823 |
| 0.7479166666666667 | 34.234 |
| 0.748611111111111 | 34.234 |
| 0.7493055555555556 | 34.234 |
| 0.75 | 34.234 |
| 0.7506944444444444 | 34.234 |
| 0.751388888888889 | 34.234 |
| 0.7520833333333333 | 34.234 |
| 0.7527777777777778 | 34.234 |
| 0.7534722222222222 | 34.234 |
| 0.7541666666666668 | 34.234 |
| 0.7548611111111111 | 34.234 |
| 0.7555555555555555 | 34.234 |
| 0.75625 | 34.234 |
| 0.7569444444444445 | 29.823 |
| 0.7576388888888889 | 29.823 |
| 0.7583333333333333 | 29.823 |
| 0.7590277777777777 | 29.823 |
| 0.7597222222222223 | 29.823 |
| 0.7604166666666666 | 29.823 |
| 0.7611111111111111 | 29.823 |
| 0.7618055555555556 | 25.419 |
| 0.7625000000000001 | 25.419 |
| 0.7631944444444444 | 25.419 |
| 0.7638888888888888 | 21.024 |
| 0.7645833333333334 | 21.024 |
| 0.7652777777777778 | 21.024 |
| 0.7659722222222222 | 21.024 |
| 0.7666666666666666 | 21.024 |
| 0.7673611111111112 | 16.636 |
| 0.7680555555555556 | 16.636 |
| 0.7687499999999999 | 16.636 |
| 0.7694444444444444 | 16.636 |
| 0.7701388888888889 | 16.636 |
| 0.7708333333333334 | 16.636 |
| 0.7715277777777777 | 12.257 |
| 0.7722222222222223 | 12.257 |
| 0.7729166666666667 | 12.257 |
| 0.7736111111111111 | 12.257 |
| 0.7743055555555555 | 12.257 |
| 0.775 | 12.257 |
| 0.7756944444444445 | 12.257 |
| 0.7763888888888889 | 12.257 |
| 0.7770833333333332 | 7.887 |
| 0.7777777777777778 | 7.887 |
| 0.7784722222222222 | 7.887 |
| 0.7791666666666667 | 7.887 |
| 0.779861111111111 | 7.887 |
| 0.7805555555555556 | 7.887 |
| 0.78125 | 3.525 |
| 0.7819444444444444 | 3.525 |
| 0.782638888888889 | 3.525 |
| 0.7833333333333333 | 3.525 |
| 0.7840277777777778 | 3.525 |
| 0.7847222222222222 | 3.525 |
| 0.7854166666666668 | 3.525 |
| 0.7861111111111111 | 3.525 |
| 0.7868055555555555 | 3.525 |
| 0.7875 | 3.525 |
| 0.7881944444444445 | 3.525 |
| 0.7888888888888889 | 0 |
| 0.7895833333333333 | 0 |
| 0.7902777777777777 | 0 |
| 0.7909722222222223 | 0 |
| 0.7916666666666666 | 0 |
| 0.7923611111111111 | 0 |
| 0.7930555555555556 | 0 |
| 0.7937500000000001 | 0 |
| 0.7944444444444444 | 0 |
| 0.7951388888888888 | 0 |
| 0.7958333333333334 | 0 |
| 0.7965277777777778 | 0 |
| 0.7972222222222222 | 0 |
| 0.7979166666666666 | 0 |
| 0.7986111111111112 | 0 |
| 0.7993055555555556 | 0 |
| 0.7999999999999999 | 0 |
| 0.8006944444444444 | 0 |
| 0.8013888888888889 | 0 |
| 0.8020833333333334 | 0 |
| 0.8027777777777777 | 0 |
| 0.8034722222222223 | 0 |
| 0.8041666666666667 | 0 |
| 0.8048611111111111 | 0 |
| 0.8055555555555555 | 0 |
| 0.80625 | 0 |
| 0.8069444444444445 | 0 |
| 0.8076388888888889 | 0 |
| 0.8083333333333332 | 0 |
| 0.8090277777777778 | 0 |
| 0.8097222222222222 | 0 |
| 0.8104166666666667 | 0 |
| 0.811111111111111 | 0 |
| 0.8118055555555556 | 0 |
| 0.8125 | 0 |
| 0.8131944444444444 | 0 |
| 0.813888888888889 | 0 |
| 0.8145833333333333 | 0 |
| 0.8152777777777778 | 0 |
| 0.8159722222222222 | 0 |
| 0.8166666666666668 | 0 |
| 0.8173611111111111 | 0 |
| 0.8180555555555555 | 0 |
| 0.81875 | 0 |
| 0.8194444444444445 | 0 |
| 0.8201388888888889 | 0 |
| 0.8208333333333333 | 0 |
| 0.8215277777777777 | 0 |
| 0.8222222222222223 | 0 |
| 0.8229166666666666 | 0 |
| 0.8236111111111111 | 0 |
| 0.8243055555555556 | 0 |
| 0.8250000000000001 | 0 |
| 0.8256944444444444 | 0 |
| 0.8263888888888888 | 0 |
| 0.8270833333333334 | 0 |
| 0.8277777777777778 | 0 |
| 0.8284722222222222 | 0 |
| 0.8291666666666666 | 0 |
| 0.8298611111111112 | 0 |
| 0.8305555555555556 | 0 |
| 0.8312499999999999 | 0 |
| 0.8319444444444444 | 0 |
| 0.8326388888888889 | 0 |
| 0.8333333333333334 | 0 |
| 0.8340277777777777 | 0 |
| 0.8347222222222223 | 0 |
| 0.8354166666666667 | 0 |
| 0.8361111111111111 | 0 |
| 0.8368055555555555 | 0 |
| 0.8375 | 0 |
| 0.8381944444444445 | 0 |
| 0.8388888888888889 | 0 |
| 0.8395833333333332 | 0 |
| 0.8402777777777778 | 0 |
| 0.8409722222222222 | 0 |
| 0.8416666666666667 | 0 |
| 0.842361111111111 | 0 |
| 0.8430555555555556 | 0 |
| 0.84375 | 0 |
| 0.8444444444444444 | 0 |
| 0.845138888888889 | 0 |
| 0.8458333333333333 | 0 |
| 0.8465277777777778 | 0 |
| 0.8472222222222222 | 0 |
| 0.8479166666666668 | 0 |
| 0.8486111111111111 | 0 |
| 0.8493055555555555 | 0 |
| 0.85 | 0 |
| 0.8506944444444445 | 0 |
| 0.8513888888888889 | 0 |
| 0.8520833333333333 | 0 |
| 0.8527777777777777 | 0 |
| 0.8534722222222223 | 0 |
| 0.8541666666666666 | 0 |
| 0.8548611111111111 | 0 |
| 0.8555555555555556 | 0 |
| 0.8562500000000001 | 0 |
| 0.8569444444444444 | 0 |
| 0.8576388888888888 | 0 |
| 0.8583333333333334 | 0 |
| 0.8590277777777778 | 0 |
| 0.8597222222222222 | 0 |
| 0.8604166666666666 | 0 |
| 0.8611111111111112 | 0 |
| 0.8618055555555556 | 0 |
| 0.8624999999999999 | 0 |
| 0.8631944444444444 | 0 |
| 0.8638888888888889 | 0 |
| 0.8645833333333334 | 0 |
| 0.8652777777777777 | 0 |
| 0.8659722222222223 | 0 |
| 0.8666666666666667 | 0 |
| 0.8673611111111111 | 0 |
| 0.8680555555555555 | 0 |
| 0.86875 | 0 |
| 0.8694444444444445 | 0 |
| 0.8701388888888889 | 0 |
| 0.8708333333333332 | 0 |
| 0.8715277777777778 | 0 |
| 0.8722222222222222 | 0 |
| 0.8729166666666667 | 0 |
| 0.873611111111111 | 0 |
| 0.8743055555555556 | 0 |
| 0.875 | 0 |
| 0.8756944444444444 | 0 |
| 0.876388888888889 | 0 |
| 0.8770833333333333 | 0 |
| 0.8777777777777778 | 0 |
| 0.8784722222222222 | 0 |
| 0.8791666666666668 | 0 |
| 0.8798611111111111 | 0 |
| 0.8805555555555555 | 0 |
| 0.88125 | 0 |
| 0.8819444444444445 | 0 |
| 0.8826388888888889 | 0 |
| 0.8833333333333333 | 0 |
| 0.8840277777777777 | 0 |
| 0.8847222222222223 | 0 |
| 0.8854166666666666 | 0 |
| 0.8861111111111111 | 0 |
| 0.8868055555555556 | 0 |
| 0.8875000000000001 | 0 |
| 0.8881944444444444 | 0 |
| 0.8888888888888888 | 0 |
| 0.8895833333333334 | 0 |
| 0.8902777777777778 | 0 |
| 0.8909722222222222 | 0 |
| 0.8916666666666666 | 0 |
| 0.8923611111111112 | 0 |
| 0.8930555555555556 | 0 |
| 0.8937499999999999 | 0 |
| 0.8944444444444444 | 0 |
| 0.8951388888888889 | 0 |
| 0.8958333333333334 | 0 |
| 0.8965277777777777 | 0 |
| 0.8972222222222223 | 0 |
| 0.8979166666666667 | 0 |
| 0.8986111111111111 | 0 |
| 0.8993055555555555 | 0 |
| 0.9 | 0 |
| 0.9006944444444445 | 0 |
| 0.9013888888888889 | 0 |
| 0.9020833333333332 | 0 |
| 0.9027777777777778 | 0 |
| 0.9034722222222222 | 0 |
| 0.9041666666666667 | 0 |
| 0.904861111111111 | 0 |
| 0.9055555555555556 | 0 |
| 0.90625 | 0 |
| 0.9069444444444444 | 0 |
| 0.907638888888889 | 0 |
| 0.9083333333333333 | 0 |
| 0.9090277777777778 | 0 |
| 0.9097222222222222 | 0 |
| 0.9104166666666668 | 0 |
| 0.9111111111111111 | 0 |
| 0.9118055555555555 | 0 |
| 0.9125 | 0 |
| 0.9131944444444445 | 0 |
| 0.9138888888888889 | 0 |
| 0.9145833333333333 | 0 |
| 0.9152777777777777 | 0 |
| 0.9159722222222223 | 0 |
| 0.9166666666666666 | 0 |
| 0.9173611111111111 | 0 |
| 0.9180555555555556 | 0 |
| 0.9187500000000001 | 0 |
| 0.9194444444444444 | 0 |
| 0.9201388888888888 | 0 |
| 0.9208333333333334 | 0 |
| 0.9215277777777778 | 0 |
| 0.9222222222222222 | 0 |
| 0.9229166666666666 | 0 |
| 0.9236111111111112 | 0 |
| 0.9243055555555556 | 0 |
| 0.9249999999999999 | 0 |
| 0.9256944444444444 | 0 |
| 0.9263888888888889 | 0 |
| 0.9270833333333334 | 0 |
| 0.9277777777777777 | 0 |
| 0.9284722222222223 | 0 |
| 0.9291666666666667 | 0 |
| 0.9298611111111111 | 0 |
| 0.9305555555555555 | 0 |
| 0.93125 | 0 |
| 0.9319444444444445 | 0 |
| 0.9326388888888889 | 0 |
| 0.9333333333333332 | 0 |
| 0.9340277777777778 | 0 |
| 0.9347222222222222 | 0 |
| 0.9354166666666667 | 0 |
| 0.936111111111111 | 0 |
| 0.9368055555555556 | 0 |
| 0.9375 | 0 |
| 0.9381944444444444 | 0 |
| 0.938888888888889 | 0 |
| 0.9395833333333333 | 0 |
| 0.9402777777777778 | 0 |
| 0.9409722222222222 | 0 |
| 0.9416666666666668 | 0 |
| 0.9423611111111111 | 0 |
| 0.9430555555555555 | 0 |
| 0.94375 | 0 |
| 0.9444444444444445 | 0 |
| 0.9451388888888889 | 0 |
| 0.9458333333333333 | 0 |
| 0.9465277777777777 | 0 |
| 0.9472222222222223 | 0 |
| 0.9479166666666666 | 0 |
| 0.9486111111111111 | 0 |
| 0.9493055555555556 | 0 |
| 0.9500000000000001 | 0 |
| 0.9506944444444444 | 0 |
| 0.9513888888888888 | 0 |
| 0.9520833333333334 | 0 |
| 0.9527777777777778 | 0 |
| 0.9534722222222222 | 0 |
| 0.9541666666666666 | 0 |
| 0.9548611111111112 | 0 |
| 0.9555555555555556 | 0 |
| 0.9562499999999999 | 0 |
| 0.9569444444444444 | 0 |
| 0.9576388888888889 | 0 |
| 0.9583333333333334 | 0 |
| 0.9590277777777777 | 0 |
| 0.9597222222222223 | 0 |
| 0.9604166666666667 | 0 |
| 0.9611111111111111 | 0 |
| 0.9618055555555555 | 0 |
| 0.9625 | 0 |
| 0.9631944444444445 | 0 |
| 0.9638888888888889 | 0 |
| 0.9645833333333332 | 0 |
| 0.9652777777777778 | 0 |
| 0.9659722222222222 | 0 |
| 0.9666666666666667 | 0 |
| 0.967361111111111 | 0 |
| 0.9680555555555556 | 0 |
| 0.96875 | 0 |
| 0.9694444444444444 | 0 |
| 0.970138888888889 | 0 |
| 0.9708333333333333 | 0 |
| 0.9715277777777778 | 0 |
| 0.9722222222222222 | 0 |
| 0.9729166666666668 | 0 |
| 0.9736111111111111 | 0 |
| 0.9743055555555555 | 0 |
| 0.975 | 0 |
| 0.9756944444444445 | 0 |
| 0.9763888888888889 | 0 |
| 0.9770833333333333 | 0 |
| 0.9777777777777777 | 0 |
| 0.9784722222222223 | 0 |
| 0.9791666666666666 | 0 |
| 0.9798611111111111 | 0 |
| 0.9805555555555556 | 0 |
| 0.9812500000000001 | 0 |
| 0.9819444444444444 | 0 |
| 0.9826388888888888 | 0 |
| 0.9833333333333334 | 0 |
| 0.9840277777777778 | 0 |
| 0.9847222222222222 | 0 |
| 0.9854166666666666 | 0 |
| 0.9861111111111112 | 0 |
| 0.9868055555555556 | 0 |
| 0.9874999999999999 | 0 |
| 0.9881944444444444 | 0 |
| 0.9888888888888889 | 0 |
| 0.9895833333333334 | 0 |
| 0.9902777777777777 | 0 |
| 0.9909722222222223 | 0 |
| 0.9916666666666667 | 0 |
| 0.9923611111111111 | 0 |
| 0.9930555555555555 | 0 |
| 0.99375 | 0 |
| 0.9944444444444445 | 0 |
| 0.9951388888888889 | 0 |
| 0.9958333333333332 | 0 |
| 0.9965277777777778 | 0 |
| 0.9972222222222222 | 0 |
| 0.9979166666666667 | 0 |
| 0.998611111111111 | 0 |
| 0.9993055555555556 | 0 |